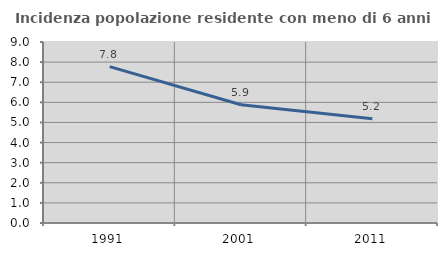
| Category | Incidenza popolazione residente con meno di 6 anni |
|---|---|
| 1991.0 | 7.774 |
| 2001.0 | 5.878 |
| 2011.0 | 5.188 |